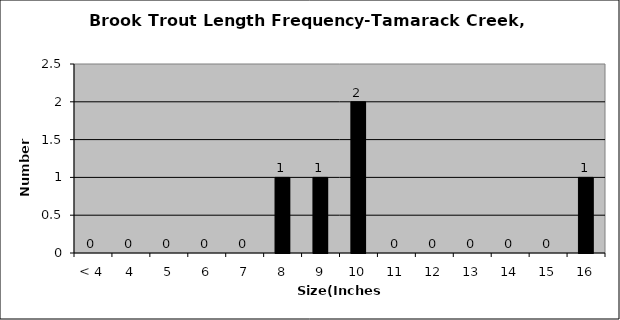
| Category | Series 0 |
|---|---|
| < 4 | 0 |
| 4 | 0 |
| 5 | 0 |
| 6 | 0 |
| 7 | 0 |
| 8 | 1 |
| 9 | 1 |
| 10 | 2 |
| 11 | 0 |
| 12 | 0 |
| 13 | 0 |
| 14 | 0 |
| 15 | 0 |
| 16 | 1 |